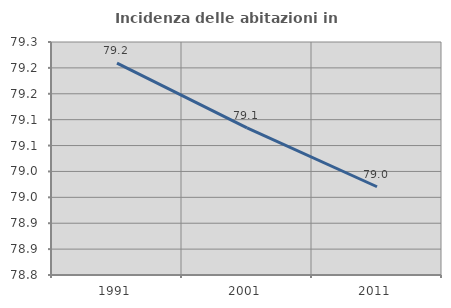
| Category | Incidenza delle abitazioni in proprietà  |
|---|---|
| 1991.0 | 79.209 |
| 2001.0 | 79.084 |
| 2011.0 | 78.97 |